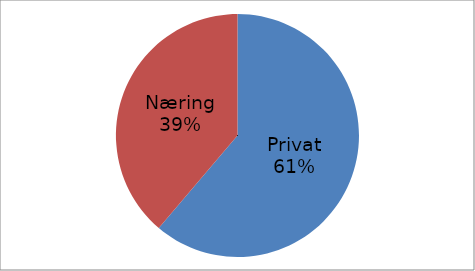
| Category | Series 0 |
|---|---|
| Privat | 53708595 |
| Næring | 34032966 |